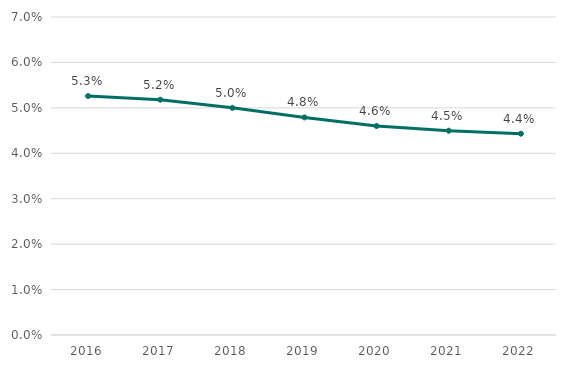
| Category | Yield |
|---|---|
| 2016.0 | 0.053 |
| 2017.0 | 0.052 |
| 2018.0 | 0.05 |
| 2019.0 | 0.048 |
| 2020.0 | 0.046 |
| 2021.0 | 0.045 |
| 2022.0 | 0.044 |